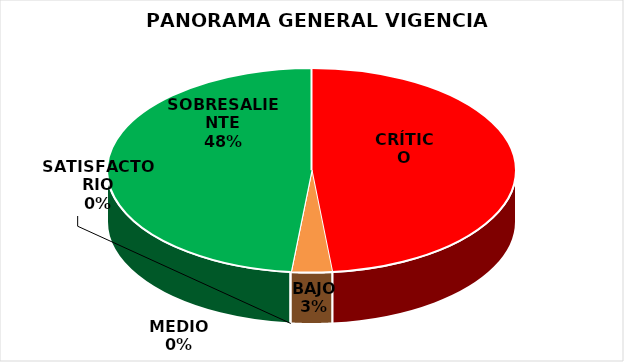
| Category | Series 0 |
|---|---|
| CRÍTICO | 15 |
| BAJO | 1 |
| MEDIO | 0 |
| SATISFACTORIO | 0 |
| SOBRESALIENTE | 15 |